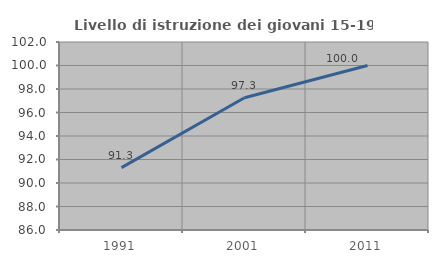
| Category | Livello di istruzione dei giovani 15-19 anni |
|---|---|
| 1991.0 | 91.304 |
| 2001.0 | 97.26 |
| 2011.0 | 100 |